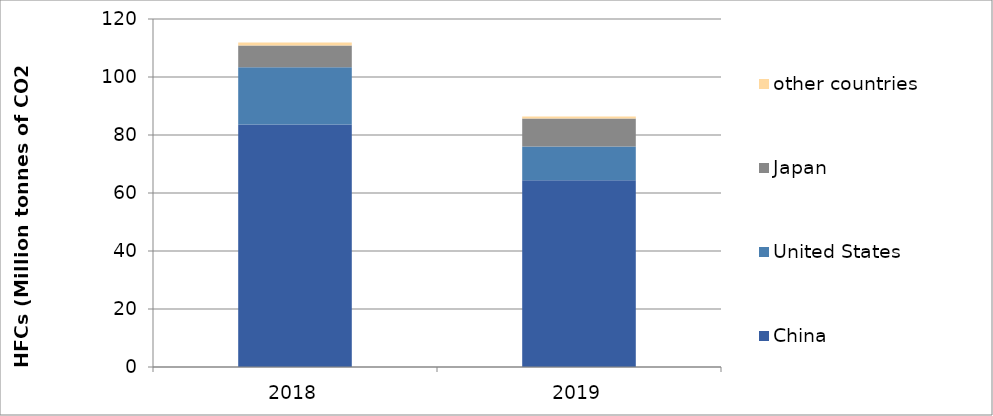
| Category | China | United States | Japan | #REF! | other countries |
|---|---|---|---|---|---|
| 2018.0 | 83.592 | 19.805 | 7.425 |  | 1.07 |
| 2019.0 | 64.367 | 11.639 | 9.643 |  | 0.745 |